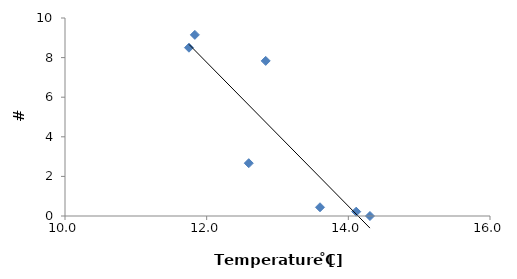
| Category | Plecoptera/Bag |
|---|---|
| 11.833333333 | 9.148 |
| 11.75 | 8.5 |
| 14.111111111 | 0.219 |
| 12.594444444 | 2.667 |
| 14.305555556 | 0 |
| 12.833333333 | 7.833 |
| 13.6 | 0.441 |